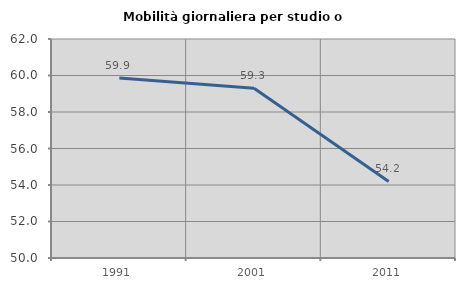
| Category | Mobilità giornaliera per studio o lavoro |
|---|---|
| 1991.0 | 59.866 |
| 2001.0 | 59.307 |
| 2011.0 | 54.196 |